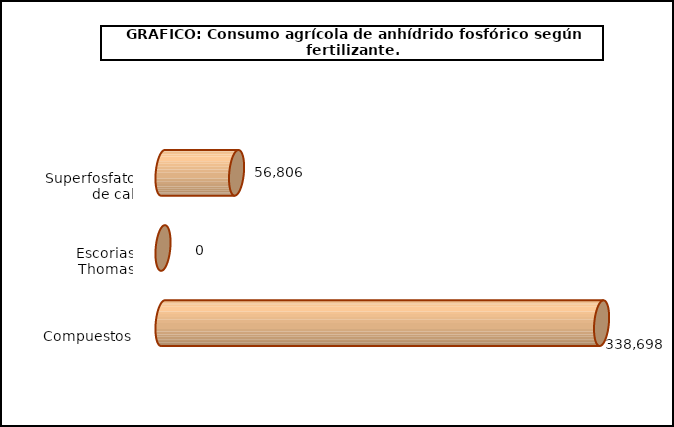
| Category | fert. N |
|---|---|
| 0 | 56806 |
| 1 | 0 |
| 2 | 338698 |